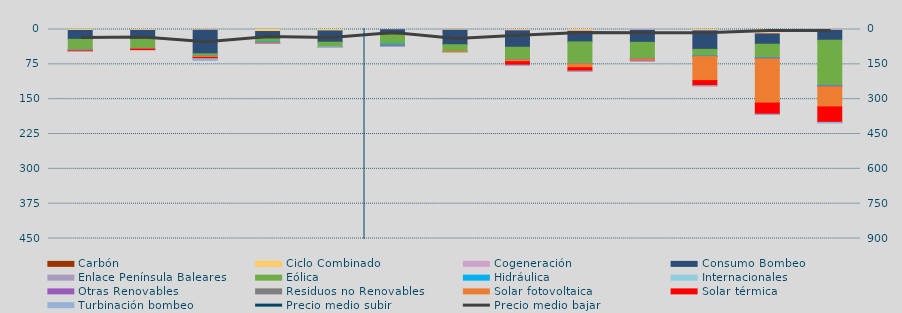
| Category | Carbón | Ciclo Combinado | Cogeneración | Consumo Bombeo | Enlace Península Baleares | Eólica | Hidráulica | Internacionales | Otras Renovables | Residuos no Renovables | Solar fotovoltaica | Solar térmica | Turbinación bombeo |
|---|---|---|---|---|---|---|---|---|---|---|---|---|---|
| 0 | 0 | 2088.417 | 56.138 | 18984.933 | 0 | 23010.334 | 40.779 | 0 | 39.002 | 82.474 | 1741.959 | 1100.186 | 17.7 |
| 1 | 20 | 1489.042 | 599.786 | 18456.273 | 0 | 20881.86 | 87.748 | 0 | 304.724 | 12.55 | 573.462 | 1034.589 | 0 |
| 2 | 0 | 1431.5 | 183.958 | 50768.847 | 0 | 5100.208 | 273.474 | 0 | 90.045 | 0 | 2259.405 | 2752.042 | 3910.508 |
| 3 | 0 | 4345.9 | 27.314 | 15616.296 | 0 | 6806.453 | 2149.971 | 0 | 152.334 | 42.654 | 44.067 | 19 | 204.333 |
| 4 | 0 | 3059.067 | 0 | 24243.492 | 0 | 10425.232 | 13.796 | 0 | 0 | 0 | 9.194 | 0 | 1113.3 |
| 5 | 0 | 0 | 655.675 | 11045.084 | 0 | 19430.531 | 3297.137 | 0 | 1221.2 | 4.575 | 380.934 | 279.19 | 100 |
| 6 | 0 | 1578.425 | 97.391 | 31105.358 | 0 | 14760.555 | 0.525 | 0 | 6.9 | 0 | 610.128 | 0 | 0 |
| 7 | 0 | 1682.35 | 1288.318 | 35237.998 | 0 | 26715.501 | 538.936 | 0 | 327.466 | 97.457 | 3459.795 | 7401.339 | 450.583 |
| 8 | 0 | 2896.525 | 1320.794 | 22481.384 | 0 | 46423.207 | 245.293 | 0 | 655.227 | 248.362 | 8080.179 | 7222.305 | 292.5 |
| 9 | 0 | 199.85 | 1687.618 | 25714.166 | 0 | 34475.114 | 354.461 | 0 | 851.955 | 108.267 | 3215.484 | 949.057 | 183.208 |
| 10 | 0 | 2332.325 | 837.542 | 39583.668 | 0 | 13865.681 | 874.017 | 0 | 764.251 | 122.4 | 51660.192 | 10959.39 | 140 |
| 11 | 0 | 8570.193 | 1044.542 | 22062.469 | 0 | 29099.06 | 778.521 | 0 | 1951.311 | 135.5 | 94698.2 | 24041.497 | 242.133 |
| 12 | 0 | 898.7 | 918.519 | 21253.542 | 0 | 97910.858 | 671.55 | 0 | 1839.655 | 0 | 43222.778 | 33235.192 | 1586.933 |